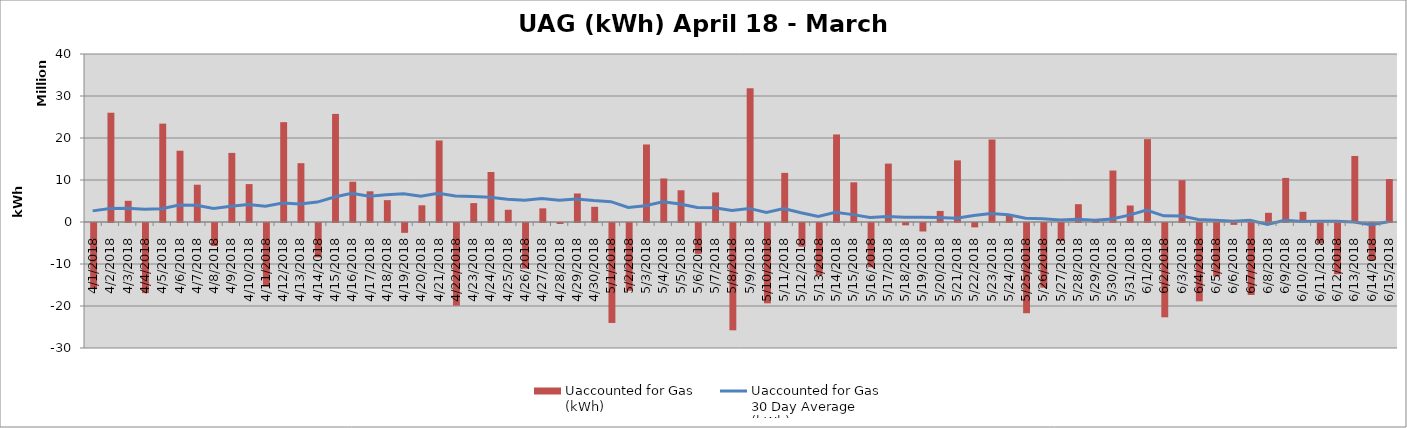
| Category | Uaccounted for Gas 
(kWh) |
|---|---|
| 4/1/18 | -15658125 |
| 4/2/18 | 26015403 |
| 4/3/18 | 5051025 |
| 4/4/18 | -16688992 |
| 4/5/18 | 23421405 |
| 4/6/18 | 16971481 |
| 4/7/18 | 8877600 |
| 4/8/18 | -5487145 |
| 4/9/18 | 16451917 |
| 4/10/18 | 9025739 |
| 4/11/18 | -15117433 |
| 4/12/18 | 23770283 |
| 4/13/18 | 14007820 |
| 4/14/18 | -8170911 |
| 4/15/18 | 25738298 |
| 4/16/18 | 9588799 |
| 4/17/18 | 7309420 |
| 4/18/18 | 5203561 |
| 4/19/18 | -2345316 |
| 4/20/18 | 3981867 |
| 4/21/18 | 19405629 |
| 4/22/18 | -19671075 |
| 4/23/18 | 4497848 |
| 4/24/18 | 11910817 |
| 4/25/18 | 2910766 |
| 4/26/18 | -10844341 |
| 4/27/18 | 3254680 |
| 4/28/18 | -243854 |
| 4/29/18 | 6794079 |
| 4/30/18 | 3621745 |
| 5/1/18 | -23802661 |
| 5/2/18 | -16136350 |
| 5/3/18 | 18458566 |
| 5/4/18 | 10370868 |
| 5/5/18 | 7556016 |
| 5/6/18 | -7345702 |
| 5/7/18 | 7043708 |
| 5/8/18 | -25547286 |
| 5/9/18 | 31871920 |
| 5/10/18 | -19127397 |
| 5/11/18 | 11702102 |
| 5/12/18 | -5654963 |
| 5/13/18 | -12375963 |
| 5/14/18 | 20842744 |
| 5/15/18 | 9447692 |
| 5/16/18 | -10529176 |
| 5/17/18 | 13908829 |
| 5/18/18 | -554376 |
| 5/19/18 | -2024676 |
| 5/20/18 | 2637353 |
| 5/21/18 | 14671991 |
| 5/22/18 | -1039536 |
| 5/23/18 | 19640267 |
| 5/24/18 | 1785745 |
| 5/25/18 | -21483294 |
| 5/26/18 | -15387521 |
| 5/27/18 | -4319399 |
| 5/28/18 | 4237166 |
| 5/29/18 | 282864 |
| 5/30/18 | 12258157 |
| 5/31/18 | 3932321 |
| 6/1/18 | 19729179 |
| 6/2/18 | -22452428 |
| 6/3/18 | 9947618 |
| 6/4/18 | -18647518 |
| 6/5/18 | -12716026 |
| 6/6/18 | -443489 |
| 6/7/18 | -17148640 |
| 6/8/18 | 2190769 |
| 6/9/18 | 10497982 |
| 6/10/18 | 2428479 |
| 6/11/18 | -4803975 |
| 6/12/18 | -12196700 |
| 6/13/18 | 15723541 |
| 6/14/18 | -8904701 |
| 6/15/18 | 10230907 |